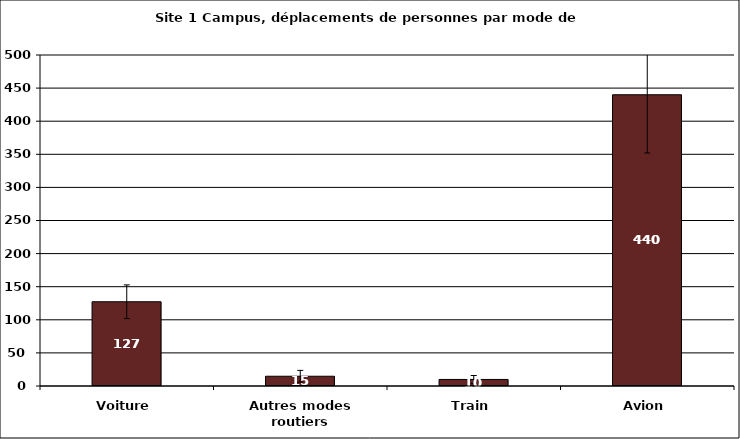
| Category | Mode de transport |
|---|---|
| Voiture | 127.266 |
| Autres modes routiers | 14.742 |
| Train | 9.905 |
| Avion | 439.94 |